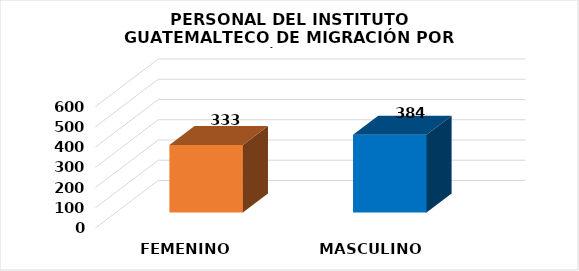
| Category | Series 0 |
|---|---|
| FEMENINO | 333 |
| MASCULINO | 384 |